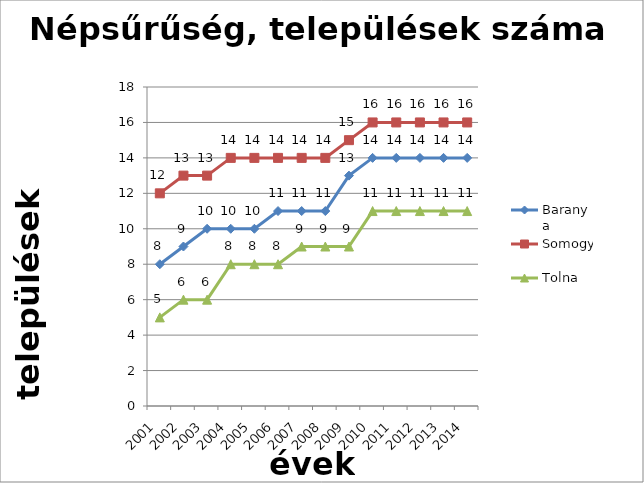
| Category | Baranya | Somogy | Tolna  |
|---|---|---|---|
| 2001.0 | 8 | 12 | 5 |
| 2002.0 | 9 | 13 | 6 |
| 2003.0 | 10 | 13 | 6 |
| 2004.0 | 10 | 14 | 8 |
| 2005.0 | 10 | 14 | 8 |
| 2006.0 | 11 | 14 | 8 |
| 2007.0 | 11 | 14 | 9 |
| 2008.0 | 11 | 14 | 9 |
| 2009.0 | 13 | 15 | 9 |
| 2010.0 | 14 | 16 | 11 |
| 2011.0 | 14 | 16 | 11 |
| 2012.0 | 14 | 16 | 11 |
| 2013.0 | 14 | 16 | 11 |
| 2014.0 | 14 | 16 | 11 |